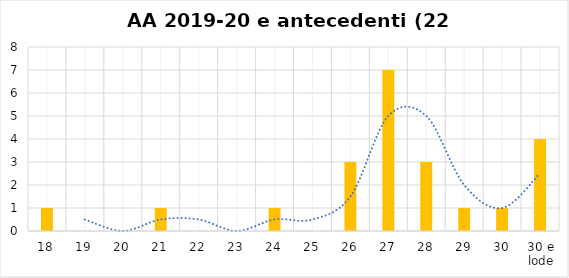
| Category | Series 0 |
|---|---|
| 18 | 1 |
| 19 | 0 |
| 20 | 0 |
| 21 | 1 |
| 22 | 0 |
| 23 | 0 |
| 24 | 1 |
| 25 | 0 |
| 26 | 3 |
| 27 | 7 |
| 28 | 3 |
| 29 | 1 |
| 30 | 1 |
| 30 e lode | 4 |